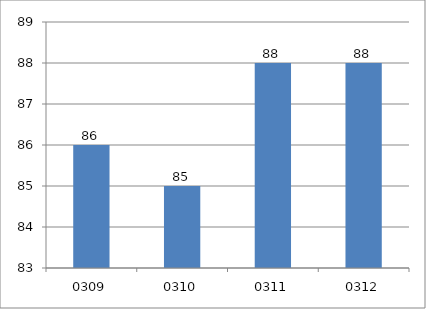
| Category | Series 0 |
|---|---|
| 309.0 | 86 |
| 310.0 | 85 |
| 311.0 | 88 |
| 312.0 | 88 |